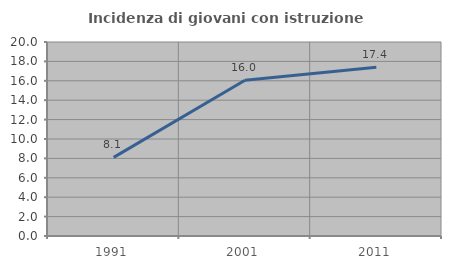
| Category | Incidenza di giovani con istruzione universitaria |
|---|---|
| 1991.0 | 8.108 |
| 2001.0 | 16.049 |
| 2011.0 | 17.391 |